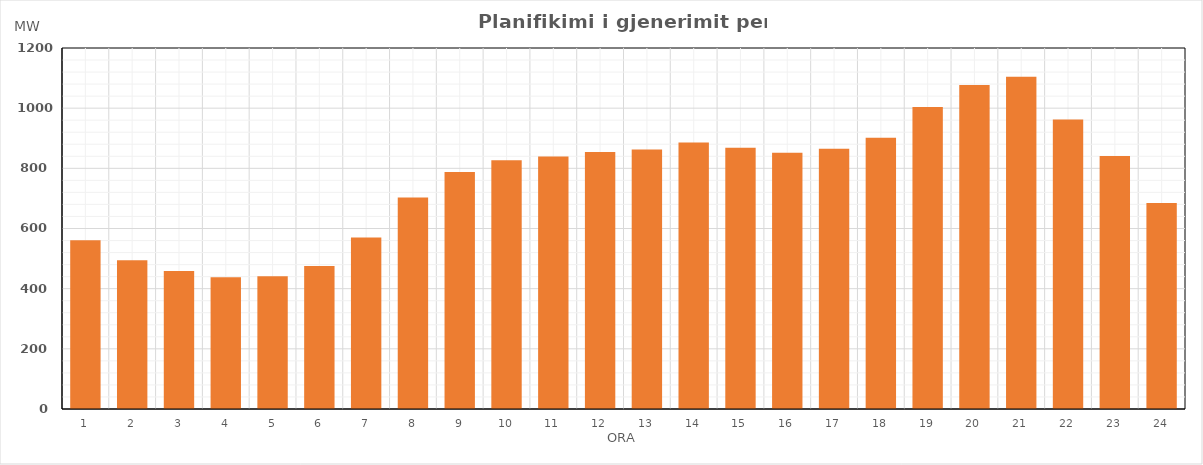
| Category | Max (MW) |
|---|---|
| 0 | 561.06 |
| 1 | 494.77 |
| 2 | 458.42 |
| 3 | 438.18 |
| 4 | 440.86 |
| 5 | 475.33 |
| 6 | 569.82 |
| 7 | 702.71 |
| 8 | 787.91 |
| 9 | 826.85 |
| 10 | 839.36 |
| 11 | 853.96 |
| 12 | 862.45 |
| 13 | 885.75 |
| 14 | 868.16 |
| 15 | 851.95 |
| 16 | 865.46 |
| 17 | 901.54 |
| 18 | 1003.87 |
| 19 | 1077.07 |
| 20 | 1104.42 |
| 21 | 962.69 |
| 22 | 840.8 |
| 23 | 684.63 |